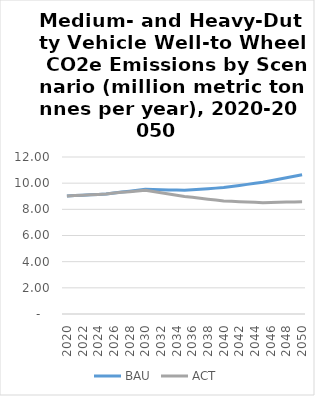
| Category | BAU | ACT |
|---|---|---|
| 2020.0 | 9.023 | 9.023 |
| 2021.0 | 9.052 | 9.052 |
| 2022.0 | 9.082 | 9.082 |
| 2023.0 | 9.112 | 9.112 |
| 2024.0 | 9.141 | 9.141 |
| 2025.0 | 9.171 | 9.171 |
| 2026.0 | 9.244 | 9.244 |
| 2027.0 | 9.316 | 9.298 |
| 2028.0 | 9.389 | 9.351 |
| 2029.0 | 9.462 | 9.405 |
| 2030.0 | 9.534 | 9.459 |
| 2031.0 | 9.518 | 9.365 |
| 2032.0 | 9.502 | 9.27 |
| 2033.0 | 9.485 | 9.176 |
| 2034.0 | 9.469 | 9.082 |
| 2035.0 | 9.453 | 8.987 |
| 2036.0 | 9.495 | 8.918 |
| 2037.0 | 9.537 | 8.848 |
| 2038.0 | 9.579 | 8.778 |
| 2039.0 | 9.621 | 8.709 |
| 2040.0 | 9.663 | 8.639 |
| 2041.0 | 9.744 | 8.614 |
| 2042.0 | 9.826 | 8.588 |
| 2043.0 | 9.907 | 8.563 |
| 2044.0 | 9.988 | 8.537 |
| 2045.0 | 10.07 | 8.512 |
| 2046.0 | 10.184 | 8.525 |
| 2047.0 | 10.298 | 8.539 |
| 2048.0 | 10.412 | 8.552 |
| 2049.0 | 10.526 | 8.566 |
| 2050.0 | 10.639 | 8.579 |